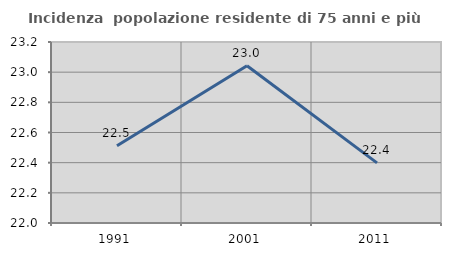
| Category | Incidenza  popolazione residente di 75 anni e più |
|---|---|
| 1991.0 | 22.512 |
| 2001.0 | 23.043 |
| 2011.0 | 22.399 |